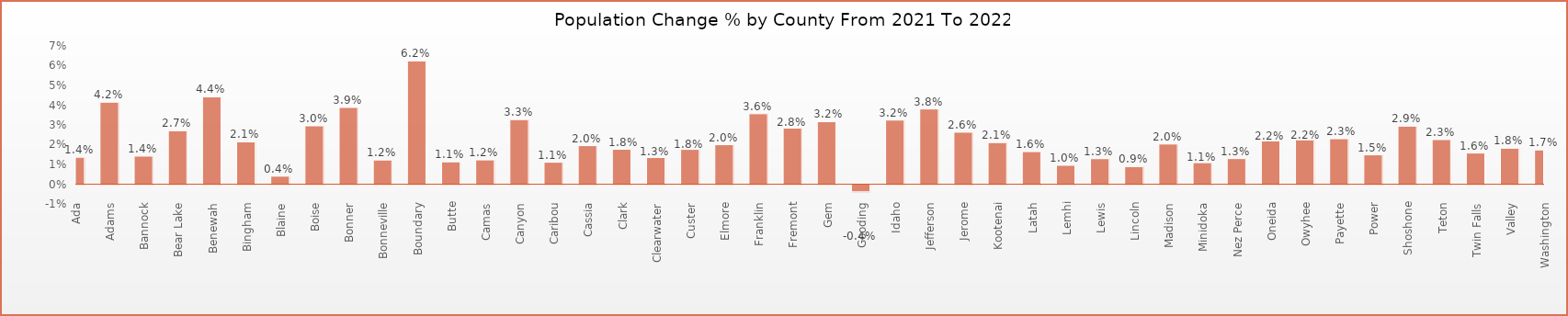
| Category | Series 0 |
|---|---|
| Ada | 0.014 |
| Adams | 0.042 |
| Bannock | 0.014 |
| Bear Lake | 0.027 |
| Benewah | 0.044 |
| Bingham | 0.021 |
| Blaine | 0.004 |
| Boise | 0.03 |
| Bonner | 0.039 |
| Bonneville | 0.012 |
| Boundary | 0.062 |
| Butte | 0.011 |
| Camas | 0.012 |
| Canyon | 0.033 |
| Caribou | 0.011 |
| Cassia | 0.02 |
| Clark | 0.018 |
| Clearwater | 0.013 |
| Custer | 0.018 |
| Elmore | 0.02 |
| Franklin | 0.036 |
| Fremont | 0.028 |
| Gem | 0.032 |
| Gooding | -0.004 |
| Idaho | 0.032 |
| Jefferson | 0.038 |
| Jerome | 0.026 |
| Kootenai | 0.021 |
| Latah | 0.016 |
| Lemhi | 0.01 |
| Lewis | 0.013 |
| Lincoln | 0.009 |
| Madison | 0.02 |
| Minidoka | 0.011 |
| Nez Perce | 0.013 |
| Oneida | 0.022 |
| Owyhee | 0.022 |
| Payette | 0.023 |
| Power | 0.015 |
| Shoshone | 0.029 |
| Teton | 0.023 |
| Twin Falls | 0.016 |
| Valley | 0.018 |
| Washington | 0.017 |